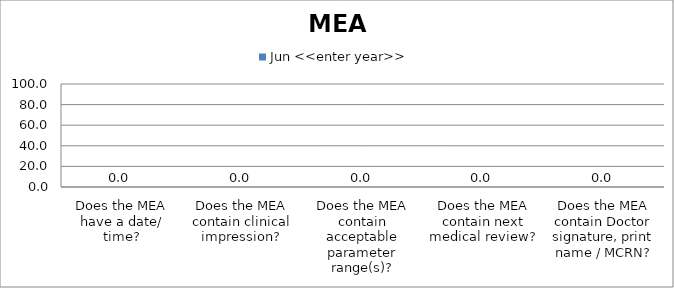
| Category | Jun <<enter year>> |
|---|---|
| Does the MEA have a date/ time? | 0 |
| Does the MEA contain clinical impression? | 0 |
| Does the MEA contain acceptable parameter range(s)? | 0 |
| Does the MEA contain next medical review? | 0 |
| Does the MEA contain Doctor signature, print name / MCRN? | 0 |